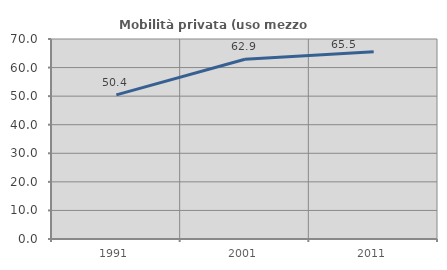
| Category | Mobilità privata (uso mezzo privato) |
|---|---|
| 1991.0 | 50.446 |
| 2001.0 | 62.893 |
| 2011.0 | 65.544 |